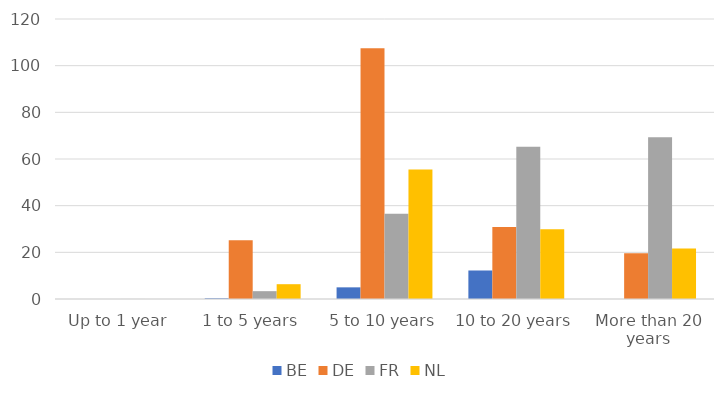
| Category | BE | DE | FR | NL |
|---|---|---|---|---|
| Up to 1 year | 0 | 0 | 0.018 | 0 |
| 1 to 5 years | 0.305 | 25.138 | 3.357 | 6.344 |
| 5 to 10 years | 4.994 | 107.482 | 36.582 | 55.511 |
| 10 to 20 years | 12.217 | 30.842 | 65.216 | 29.939 |
| More than 20 years | 0 | 19.639 | 69.359 | 21.674 |